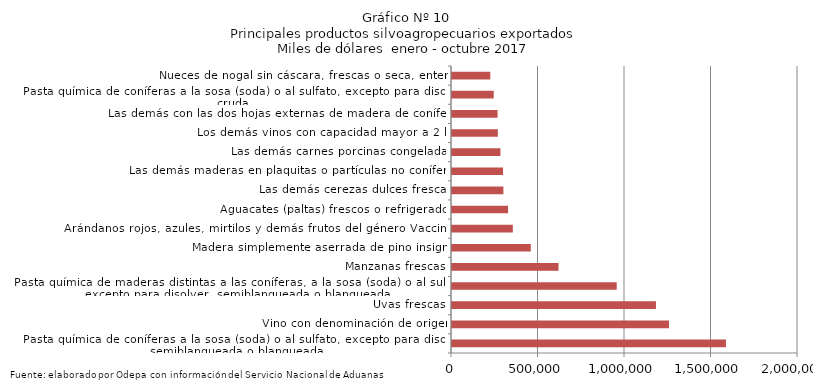
| Category | Series 0 |
|---|---|
| Pasta química de coníferas a la sosa (soda) o al sulfato, excepto para disolver, semiblanqueada o blanqueada | 1583753.797 |
| Vino con denominación de origen | 1254583.415 |
| Uvas frescas | 1178922.816 |
| Pasta química de maderas distintas a las coníferas, a la sosa (soda) o al sulfato, excepto para disolver, semiblanqueada o blanqueada | 952020.52 |
| Manzanas frescas | 615648.839 |
| Madera simplemente aserrada de pino insigne | 455385.495 |
| Arándanos rojos, azules, mirtilos y demás frutos del género Vaccinium | 351689.625 |
| Aguacates (paltas) frescos o refrigerados | 324007.161 |
| Las demás cerezas dulces frescas | 296972.615 |
| Las demás maderas en plaquitas o partículas no coníferas | 295006.62 |
| Las demás carnes porcinas congeladas | 279987.884 |
| Los demás vinos con capacidad mayor a 2 lts | 265036.585 |
| Las demás con las dos hojas externas de madera de coníferas | 263397.48 |
| Pasta química de coníferas a la sosa (soda) o al sulfato, excepto para disolver, cruda | 241231.766 |
| Nueces de nogal sin cáscara, frescas o seca, enteras | 221238.544 |